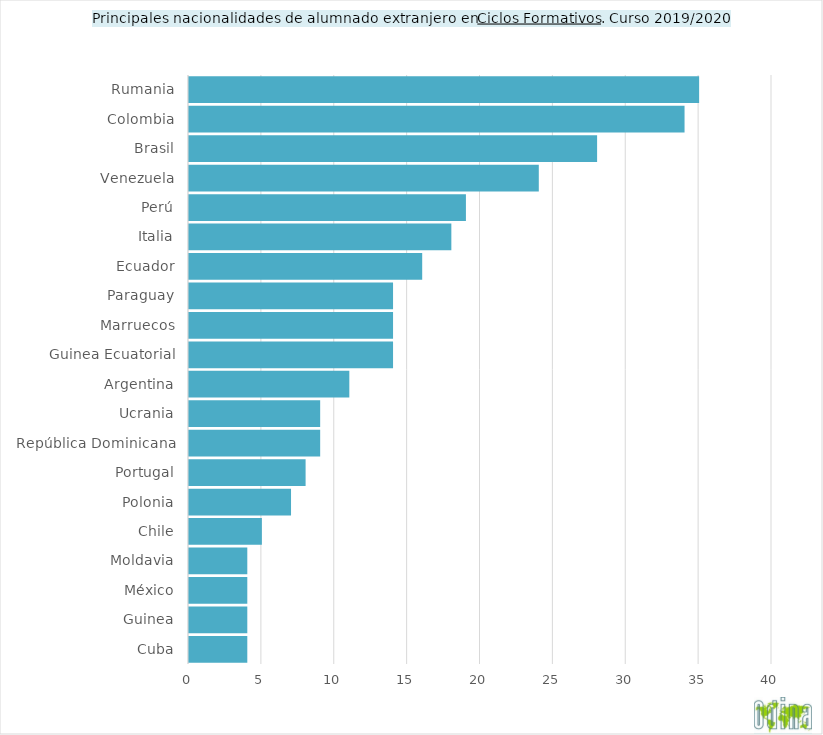
| Category | TOTAL |
|---|---|
| Cuba | 4 |
| Guinea | 4 |
| México | 4 |
| Moldavia | 4 |
| Chile | 5 |
| Polonia | 7 |
| Portugal | 8 |
| República Dominicana | 9 |
| Ucrania | 9 |
| Argentina | 11 |
| Guinea Ecuatorial | 14 |
| Marruecos | 14 |
| Paraguay | 14 |
| Ecuador | 16 |
| Italia | 18 |
| Perú | 19 |
| Venezuela | 24 |
| Brasil | 28 |
| Colombia | 34 |
| Rumania | 35 |